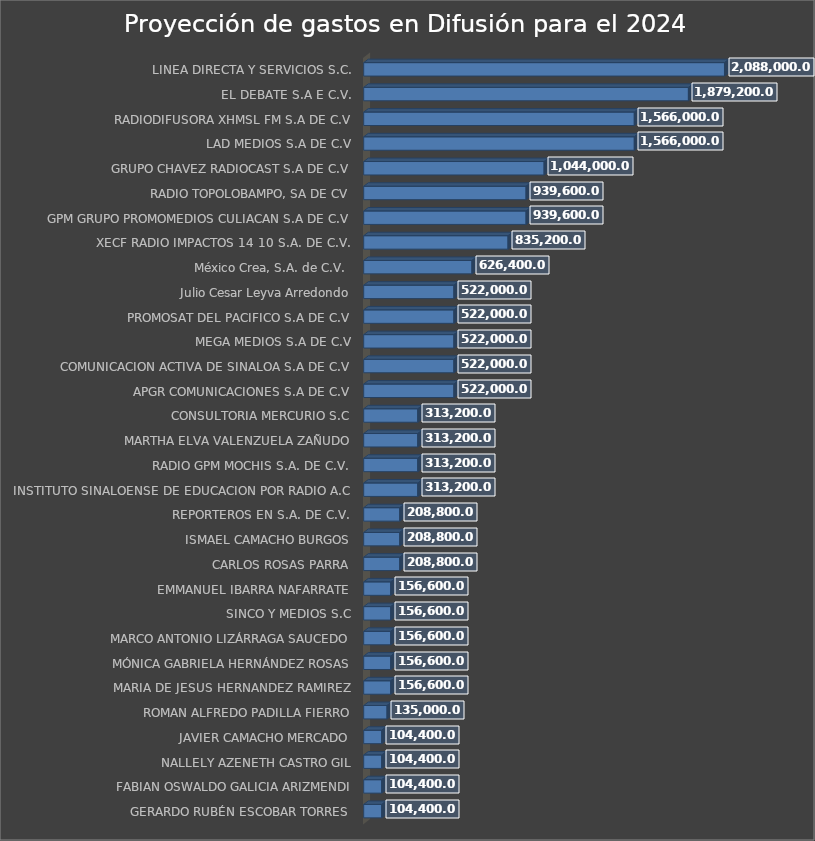
| Category | Monto |
|---|---|
| GERARDO RUBÉN ESCOBAR TORRES | 104400 |
| FABIAN OSWALDO GALICIA ARIZMENDI | 104400 |
| NALLELY AZENETH CASTRO GIL | 104400 |
| JAVIER CAMACHO MERCADO | 104400 |
| ROMAN ALFREDO PADILLA FIERRO | 135000 |
| MARIA DE JESUS HERNANDEZ RAMIREZ | 156600 |
| MÓNICA GABRIELA HERNÁNDEZ ROSAS | 156600 |
| MARCO ANTONIO LIZÁRRAGA SAUCEDO | 156600 |
| SINCO Y MEDIOS S.C | 156600 |
| EMMANUEL IBARRA NAFARRATE | 156600 |
| CARLOS ROSAS PARRA | 208800 |
| ISMAEL CAMACHO BURGOS | 208800 |
| REPORTEROS EN S.A. DE C.V. | 208800 |
| INSTITUTO SINALOENSE DE EDUCACION POR RADIO A.C | 313200 |
| RADIO GPM MOCHIS S.A. DE C.V. | 313200 |
| MARTHA ELVA VALENZUELA ZAÑUDO | 313200 |
| CONSULTORIA MERCURIO S.C | 313200 |
| APGR COMUNICACIONES S.A DE C.V | 522000 |
| COMUNICACION ACTIVA DE SINALOA S.A DE C.V | 522000 |
| MEGA MEDIOS S.A DE C.V | 522000 |
| PROMOSAT DEL PACIFICO S.A DE C.V | 522000 |
| Julio Cesar Leyva Arredondo | 522000 |
| México Crea, S.A. de C.V.  | 626400 |
| XECF RADIO IMPACTOS 14 10 S.A. DE C.V. | 835200 |
| GPM GRUPO PROMOMEDIOS CULIACAN S.A DE C.V | 939600 |
| RADIO TOPOLOBAMPO, SA DE CV | 939600 |
| GRUPO CHAVEZ RADIOCAST S.A DE C.V | 1044000 |
| LAD MEDIOS S.A DE C.V | 1566000 |
| RADIODIFUSORA XHMSL FM S.A DE C.V | 1566000 |
| EL DEBATE S.A E C.V. | 1879200 |
| LINEA DIRECTA Y SERVICIOS S.C. | 2088000 |